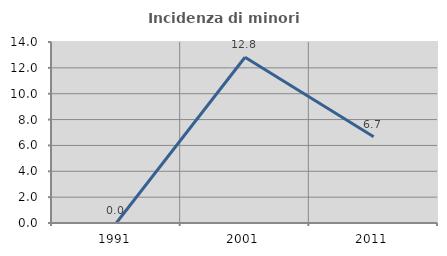
| Category | Incidenza di minori stranieri |
|---|---|
| 1991.0 | 0 |
| 2001.0 | 12.821 |
| 2011.0 | 6.667 |